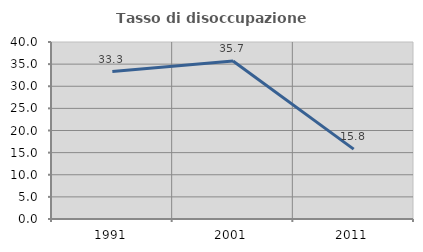
| Category | Tasso di disoccupazione giovanile  |
|---|---|
| 1991.0 | 33.333 |
| 2001.0 | 35.714 |
| 2011.0 | 15.789 |